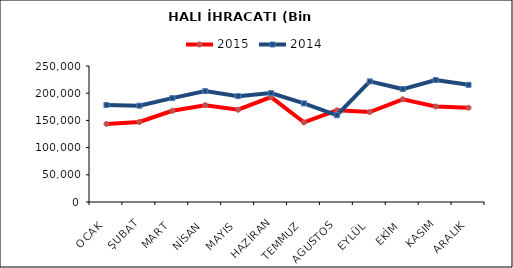
| Category | 2015 | 2014 |
|---|---|---|
| OCAK | 143592.341 | 178356.88 |
| ŞUBAT | 147034.173 | 177087.667 |
| MART | 167697.597 | 190935.248 |
| NİSAN | 177976.829 | 203831.748 |
| MAYIS | 169615.877 | 194613.765 |
| HAZİRAN | 192780.133 | 200165.098 |
| TEMMUZ | 146408.976 | 181218.242 |
| AGUSTOS | 168540.448 | 159444.416 |
| EYLÜL | 165351.194 | 221742.836 |
| EKİM | 188791.914 | 207599.221 |
| KASIM | 175503.858 | 224143.156 |
| ARALIK | 173300.988 | 215403.105 |